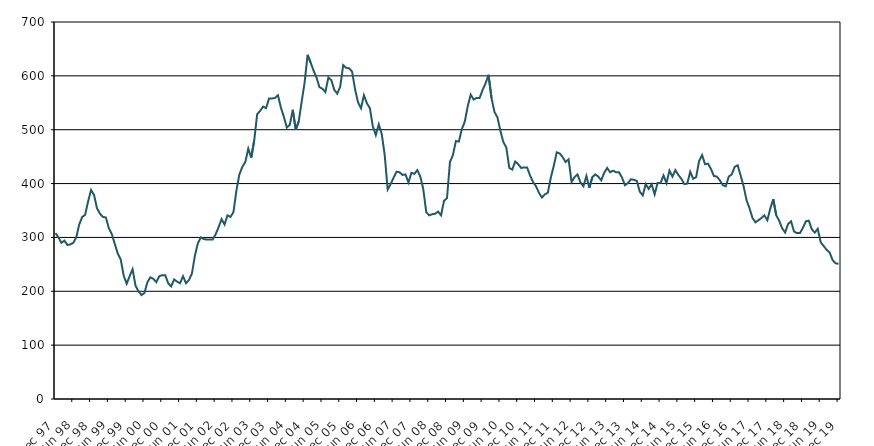
| Category | Series 0 |
|---|---|
| 1997-12-01 | 308 |
| 1998-01-01 | 300 |
| 1998-02-01 | 290 |
| 1998-03-01 | 294 |
| 1998-04-01 | 286 |
| 1998-05-01 | 287 |
| 1998-06-01 | 290 |
| 1998-07-01 | 300 |
| 1998-08-01 | 324 |
| 1998-09-01 | 338 |
| 1998-10-01 | 342 |
| 1998-11-01 | 367 |
| 1998-12-01 | 388 |
| 1999-01-01 | 379 |
| 1999-02-01 | 354 |
| 1999-03-01 | 344 |
| 1999-04-01 | 338 |
| 1999-05-01 | 337 |
| 1999-06-01 | 317 |
| 1999-07-01 | 306 |
| 1999-08-01 | 288 |
| 1999-09-01 | 270 |
| 1999-10-01 | 259 |
| 1999-11-01 | 229 |
| 1999-12-01 | 214 |
| 2000-01-01 | 228 |
| 2000-02-01 | 241 |
| 2000-03-01 | 210 |
| 2000-04-01 | 200 |
| 2000-05-01 | 193 |
| 2000-06-01 | 197 |
| 2000-07-01 | 217 |
| 2000-08-01 | 226 |
| 2000-09-01 | 223 |
| 2000-10-01 | 217 |
| 2000-11-01 | 228 |
| 2000-12-01 | 230 |
| 2001-01-01 | 230 |
| 2001-02-01 | 215 |
| 2001-03-01 | 209 |
| 2001-04-01 | 222 |
| 2001-05-01 | 218 |
| 2001-06-01 | 215 |
| 2001-07-01 | 228 |
| 2001-08-01 | 215 |
| 2001-09-01 | 221 |
| 2001-10-01 | 233 |
| 2001-11-01 | 266 |
| 2001-12-01 | 289 |
| 2002-01-01 | 300 |
| 2002-02-01 | 297 |
| 2002-03-01 | 296 |
| 2002-04-01 | 296 |
| 2002-05-01 | 296 |
| 2002-06-01 | 306 |
| 2002-07-01 | 319 |
| 2002-08-01 | 334 |
| 2002-09-01 | 324 |
| 2002-10-01 | 341 |
| 2002-11-01 | 338 |
| 2002-12-01 | 347 |
| 2003-01-01 | 387 |
| 2003-02-01 | 417 |
| 2003-03-01 | 431 |
| 2003-04-01 | 440 |
| 2003-05-01 | 465 |
| 2003-06-01 | 448 |
| 2003-07-01 | 480 |
| 2003-08-01 | 529 |
| 2003-09-01 | 535 |
| 2003-10-01 | 543 |
| 2003-11-01 | 540 |
| 2003-12-01 | 558 |
| 2004-01-01 | 558 |
| 2004-02-01 | 559 |
| 2004-03-01 | 564 |
| 2004-04-01 | 541 |
| 2004-05-01 | 524 |
| 2004-06-01 | 504 |
| 2004-07-01 | 509 |
| 2004-08-01 | 537 |
| 2004-09-01 | 500 |
| 2004-10-01 | 515 |
| 2004-11-01 | 552 |
| 2004-12-01 | 588 |
| 2005-01-01 | 639 |
| 2005-02-01 | 625 |
| 2005-03-01 | 610 |
| 2005-04-01 | 597 |
| 2005-05-01 | 579 |
| 2005-06-01 | 576 |
| 2005-07-01 | 570 |
| 2005-08-01 | 597 |
| 2005-09-01 | 592 |
| 2005-10-01 | 574 |
| 2005-11-01 | 567 |
| 2005-12-01 | 580 |
| 2006-01-01 | 620 |
| 2006-02-01 | 615 |
| 2006-03-01 | 614 |
| 2006-04-01 | 608 |
| 2006-05-01 | 575 |
| 2006-06-01 | 551 |
| 2006-07-01 | 540 |
| 2006-08-01 | 564 |
| 2006-09-01 | 549 |
| 2006-10-01 | 540 |
| 2006-11-01 | 506 |
| 2006-12-01 | 490 |
| 2007-01-01 | 510 |
| 2007-02-01 | 492 |
| 2007-03-01 | 453 |
| 2007-04-01 | 389 |
| 2007-05-01 | 399 |
| 2007-06-01 | 411 |
| 2007-07-01 | 422 |
| 2007-08-01 | 421 |
| 2007-09-01 | 416 |
| 2007-10-01 | 417 |
| 2007-11-01 | 402 |
| 2007-12-01 | 420 |
| 2008-01-01 | 418 |
| 2008-02-01 | 425 |
| 2008-03-01 | 413 |
| 2008-04-01 | 390 |
| 2008-05-01 | 347 |
| 2008-06-01 | 341 |
| 2008-07-01 | 343 |
| 2008-08-01 | 344 |
| 2008-09-01 | 348 |
| 2008-10-01 | 341 |
| 2008-11-01 | 368 |
| 2008-12-01 | 373 |
| 2009-01-01 | 440 |
| 2009-02-01 | 453 |
| 2009-03-01 | 479 |
| 2009-04-01 | 478 |
| 2009-05-01 | 501 |
| 2009-06-01 | 515 |
| 2009-07-01 | 544 |
| 2009-08-01 | 565 |
| 2009-09-01 | 556 |
| 2009-10-01 | 559 |
| 2009-11-01 | 559 |
| 2009-12-01 | 574 |
| 2010-01-01 | 586 |
| 2010-02-01 | 602 |
| 2010-03-01 | 559 |
| 2010-04-01 | 533 |
| 2010-05-01 | 523 |
| 2010-06-01 | 498 |
| 2010-07-01 | 477 |
| 2010-08-01 | 467 |
| 2010-09-01 | 429 |
| 2010-10-01 | 426 |
| 2010-11-01 | 441 |
| 2010-12-01 | 436 |
| 2011-01-01 | 429 |
| 2011-02-01 | 430 |
| 2011-03-01 | 430 |
| 2011-04-01 | 415 |
| 2011-05-01 | 403 |
| 2011-06-01 | 395 |
| 2011-07-01 | 383 |
| 2011-08-01 | 374 |
| 2011-09-01 | 380 |
| 2011-10-01 | 383 |
| 2011-11-01 | 411 |
| 2011-12-01 | 433 |
| 2012-01-01 | 458 |
| 2012-02-01 | 456 |
| 2012-03-01 | 449 |
| 2012-04-01 | 440 |
| 2012-05-01 | 445 |
| 2012-06-01 | 403 |
| 2012-07-01 | 412 |
| 2012-08-01 | 417 |
| 2012-09-01 | 402 |
| 2012-10-01 | 395 |
| 2012-11-01 | 414 |
| 2012-12-01 | 392 |
| 2013-01-01 | 412 |
| 2013-02-01 | 417 |
| 2013-03-01 | 413 |
| 2013-04-01 | 406 |
| 2013-05-01 | 420 |
| 2013-06-01 | 429 |
| 2013-07-01 | 421 |
| 2013-08-01 | 424 |
| 2013-09-01 | 421 |
| 2013-10-01 | 421 |
| 2013-11-01 | 411 |
| 2013-12-01 | 397 |
| 2014-01-01 | 401 |
| 2014-02-01 | 408 |
| 2014-03-01 | 407 |
| 2014-04-01 | 405 |
| 2014-05-01 | 385 |
| 2014-06-01 | 378 |
| 2014-07-01 | 399 |
| 2014-08-01 | 390 |
| 2014-09-01 | 399 |
| 2014-10-01 | 380 |
| 2014-11-01 | 401 |
| 2014-12-01 | 401 |
| 2015-01-01 | 415 |
| 2015-02-01 | 401 |
| 2015-03-01 | 424 |
| 2015-04-01 | 413 |
| 2015-05-01 | 425 |
| 2015-06-01 | 416 |
| 2015-07-01 | 409 |
| 2015-08-01 | 399 |
| 2015-09-01 | 400 |
| 2015-10-01 | 422 |
| 2015-11-01 | 409 |
| 2015-12-01 | 412 |
| 2016-01-01 | 442 |
| 2016-02-01 | 453 |
| 2016-03-01 | 436 |
| 2016-04-01 | 437 |
| 2016-05-01 | 427 |
| 2016-06-01 | 414 |
| 2016-07-01 | 413 |
| 2016-08-01 | 406 |
| 2016-09-01 | 397 |
| 2016-10-01 | 395 |
| 2016-11-01 | 413 |
| 2016-12-01 | 417 |
| 2017-01-01 | 431 |
| 2017-02-01 | 434 |
| 2017-03-01 | 415 |
| 2017-04-01 | 395 |
| 2017-05-01 | 369 |
| 2017-06-01 | 354 |
| 2017-07-01 | 336 |
| 2017-08-01 | 328 |
| 2017-09-01 | 332 |
| 2017-10-01 | 336 |
| 2017-11-01 | 341 |
| 2017-12-01 | 332 |
| 2018-01-01 | 354 |
| 2018-02-01 | 371 |
| 2018-03-01 | 341 |
| 2018-04-01 | 331 |
| 2018-05-01 | 317 |
| 2018-06-01 | 309 |
| 2018-07-01 | 325 |
| 2018-08-01 | 330 |
| 2018-09-01 | 311 |
| 2018-10-01 | 308 |
| 2018-11-01 | 308 |
| 2018-12-01 | 318 |
| 2019-01-01 | 330 |
| 2019-02-01 | 331 |
| 2019-03-01 | 315 |
| 2019-04-01 | 309 |
| 2019-05-01 | 316 |
| 2019-06-01 | 291 |
| 2019-07-01 | 284 |
| 2019-08-01 | 277 |
| 2019-09-01 | 272 |
| 2019-10-01 | 258 |
| 2019-11-01 | 252 |
| 2019-12-01 | 251 |